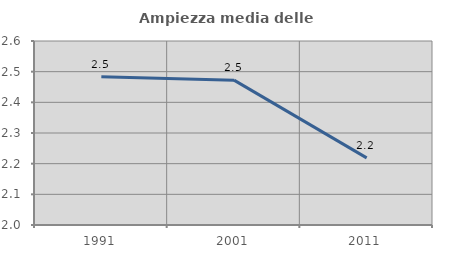
| Category | Ampiezza media delle famiglie |
|---|---|
| 1991.0 | 2.484 |
| 2001.0 | 2.472 |
| 2011.0 | 2.219 |